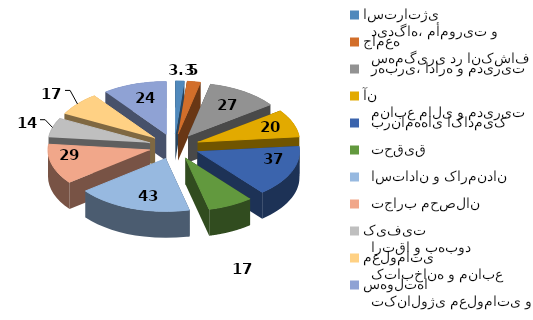
| Category | Series 0 | Series 1 |
|---|---|---|
|   دیدگاه، مأموریت و استراتژی | 3.3 | 0 |
|   سهم‌گیری در انکشاف جامعه | 5 | 0 |
|   رهبری، اداره و مدیریت | 27 | 0 |
|   منابع مالی و مدیریت آن | 20 | 0 |
|   برنامه‌های اکادمیک | 37 | 0 |
|   تحقیق | 17 | 0 |
|   استادان و کارمندان | 43 | 0 |
|   تجارب محصلان | 29 | 0 |
|   ارتقا و بهبود کیفیت | 14 | 0 |
|   کتابخانه و منابع معلوماتی | 17 | 0 |
|   تکنالوژی معلوماتی و سهولت‌ها | 24 | 0 |